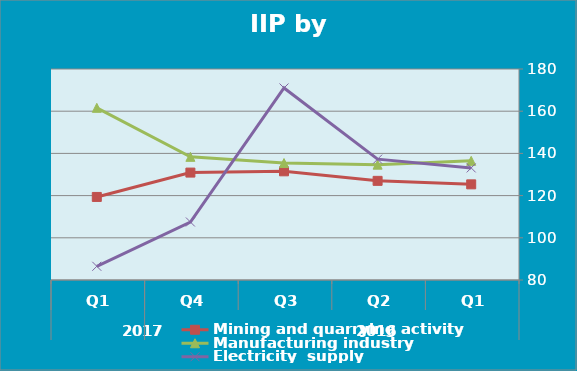
| Category | IIPالرقم القياسي العام  | Mining and quarrying activity  | Manufacturing industry  | Electricity  supply  |
|---|---|---|---|---|
| 0 |  | 125.33 | 136.47 | 133.12 |
| 1 |  | 126.99 | 134.67 | 137.27 |
| 2 |  | 131.51 | 135.43 | 171 |
| 3 |  | 130.91 | 138.37 | 107.49 |
| 4 |  | 119.36 | 161.6 | 86.5 |